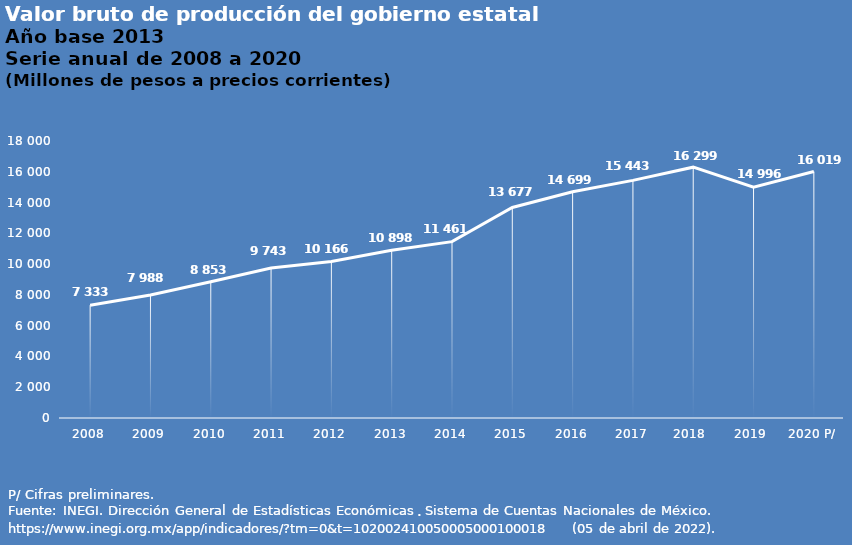
| Category | Series 0 |
|---|---|
| 2008 | 7333 |
| 2009 | 7988 |
| 2010 | 8853 |
| 2011 | 9743 |
| 2012 | 10166 |
| 2013 | 10898 |
| 2014 | 11461 |
| 2015 | 13677 |
| 2016 | 14699 |
| 2017 | 15443 |
| 2018  | 16299 |
| 2019  | 14996 |
| 2020 P/ | 16019 |